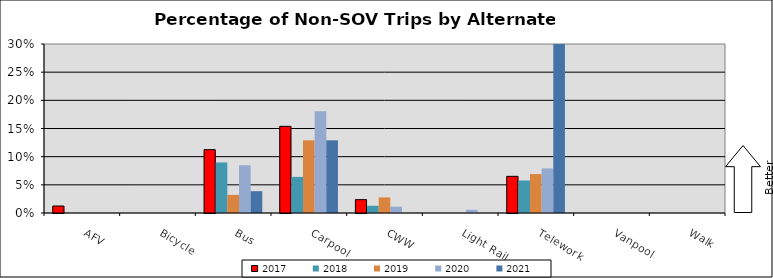
| Category | 2017 | 2018 | 2019 | 2020 | 2021 |
|---|---|---|---|---|---|
| AFV | 0.012 | 0 | 0 | 0 | 0 |
| Bicycle | 0 | 0 | 0 | 0 | 0 |
| Bus | 0.112 | 0.09 | 0.032 | 0.085 | 0.039 |
| Carpool | 0.154 | 0.064 | 0.129 | 0.181 | 0.129 |
| CWW | 0.024 | 0.013 | 0.028 | 0.011 | 0 |
| Light Rail | 0 | 0 | 0 | 0.006 | 0 |
| Telework | 0.065 | 0.058 | 0.069 | 0.079 | 0.323 |
| Vanpool | 0 | 0 | 0 | 0 | 0 |
| Walk | 0 | 0 | 0 | 0 | 0 |